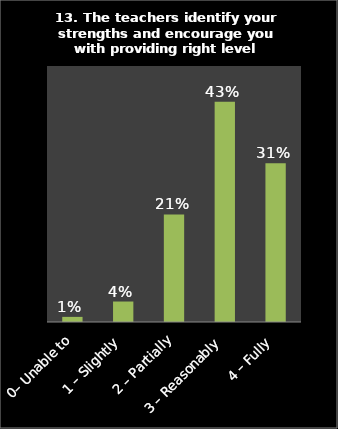
| Category | Series 0 |
|---|---|
| 0– Unable to | 0.01 |
| 1 – Slightly | 0.04 |
| 2 – Partially | 0.21 |
| 3 – Reasonably | 0.43 |
| 4 – Fully | 0.31 |